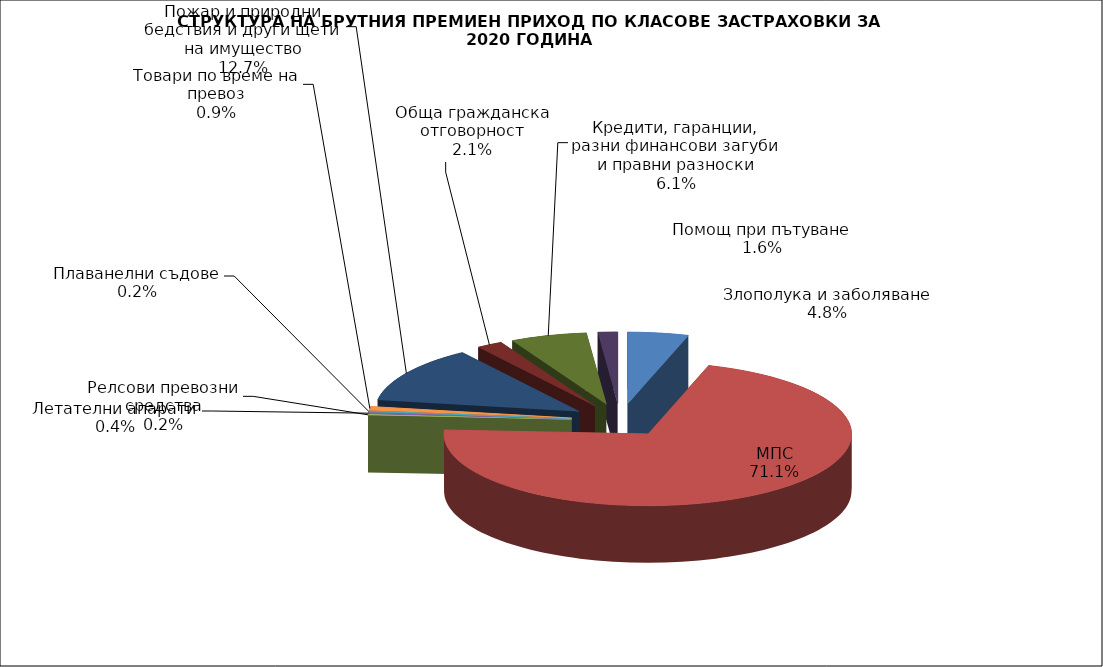
| Category | Злополука и заболяване |
|---|---|
| Злополука и заболяване | 0.048 |
| МПС | 0.711 |
| Релсови превозни средства | 0.002 |
| Летателни апарати | 0.004 |
| Плаванелни съдове | 0.002 |
| Товари по време на превоз | 0.009 |
| Пожар и природни бедствия и други щети на имущество | 0.127 |
| Обща гражданска отговорност | 0.021 |
| Кредити, гаранции, разни финансови загуби и правни разноски | 0.061 |
| Помощ при пътуване | 0.016 |